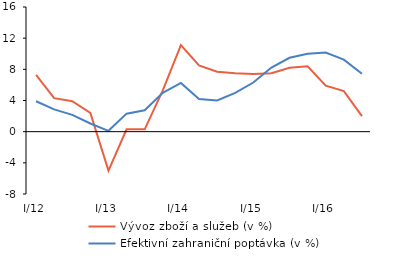
| Category | Vývoz zboží a služeb (v %) | Efektivní zahraniční poptávka (v %) |
|---|---|---|
| I/12 | 7.3 | 3.901 |
| II | 4.3 | 2.862 |
| III | 3.9 | 2.157 |
| IV | 2.4 | 1.045 |
| I/13 | -5 | 0.109 |
| II | 0.3 | 2.313 |
| III | 0.3 | 2.749 |
| IV | 5.3 | 4.981 |
| I/14 | 11.1 | 6.248 |
| II | 8.5 | 4.178 |
| III | 7.7 | 4.007 |
| IV | 7.5 | 4.979 |
| I/15 | 7.4 | 6.304 |
| II | 7.5 | 8.233 |
| III | 8.2 | 9.484 |
| IV | 8.4 | 9.995 |
| I/16 | 5.9 | 10.151 |
| II | 5.2 | 9.249 |
| III | 2 | 7.424 |